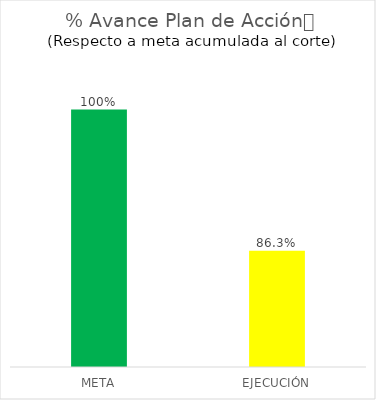
| Category | % Avance Plan de Acción
(Respecto a meta acumulada al corte) |
|---|---|
| META | 1 |
| EJECUCIÓN | 0.863 |